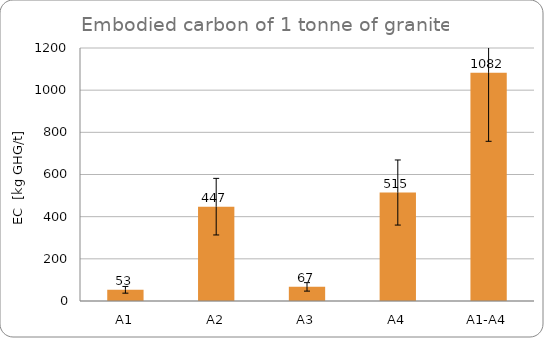
| Category | Series 0 |
|---|---|
| A1 | 53.1 |
| A2 | 447.45 |
| A3 | 67 |
| A4 | 514.5 |
| A1-A4 | 1082.05 |